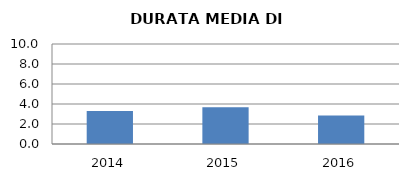
| Category | 2014 2015 2016 |
|---|---|
| 2014.0 | 3.308 |
| 2015.0 | 3.667 |
| 2016.0 | 2.85 |